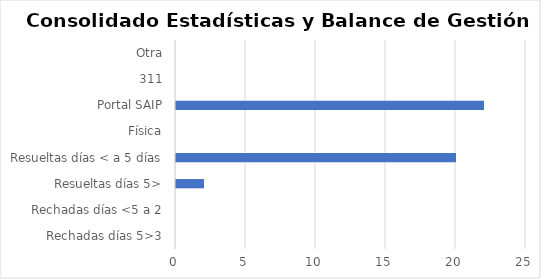
| Category | Series 0 |
|---|---|
| Rechadas días 5>3 | 0 |
| Rechadas días <5 a 2 | 0 |
| Resueltas días 5> | 2 |
| Resueltas días < a 5 días | 20 |
| Física | 0 |
| Portal SAIP | 22 |
| 311 | 0 |
| Otra | 0 |